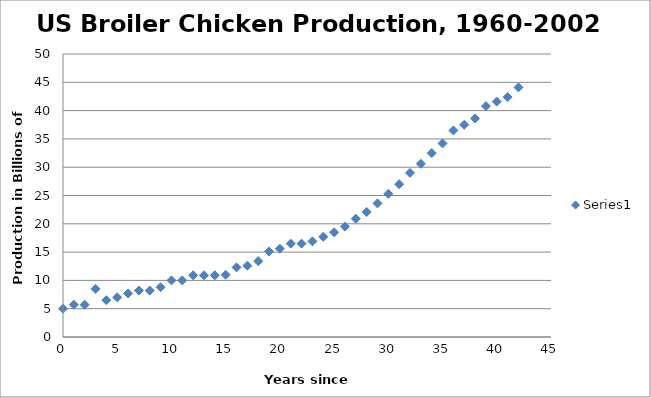
| Category | Series 0 |
|---|---|
| 0.0 | 5 |
| 1.0 | 5.7 |
| 2.0 | 5.7 |
| 3.0 | 8.5 |
| 4.0 | 6.5 |
| 5.0 | 7 |
| 6.0 | 7.7 |
| 7.0 | 8.2 |
| 8.0 | 8.2 |
| 9.0 | 8.8 |
| 10.0 | 10 |
| 11.0 | 10 |
| 12.0 | 10.9 |
| 13.0 | 10.9 |
| 14.0 | 10.9 |
| 15.0 | 11 |
| 16.0 | 12.3 |
| 17.0 | 12.6 |
| 18.0 | 13.4 |
| 19.0 | 15.1 |
| 20.0 | 15.6 |
| 21.0 | 16.5 |
| 22.0 | 16.5 |
| 23.0 | 16.9 |
| 24.0 | 17.7 |
| 25.0 | 18.5 |
| 26.0 | 19.5 |
| 27.0 | 20.9 |
| 28.0 | 22.1 |
| 29.0 | 23.6 |
| 30.0 | 25.3 |
| 31.0 | 27 |
| 32.0 | 29 |
| 33.0 | 30.6 |
| 34.0 | 32.5 |
| 35.0 | 34.2 |
| 36.0 | 36.5 |
| 37.0 | 37.5 |
| 38.0 | 38.6 |
| 39.0 | 40.8 |
| 40.0 | 41.6 |
| 41.0 | 42.4 |
| 42.0 | 44.1 |